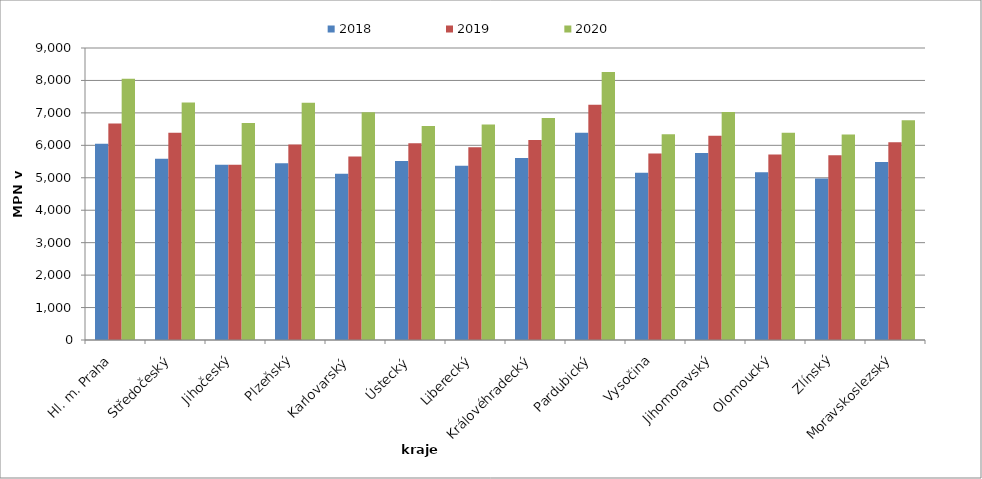
| Category | 2018 | 2019 | 2020 |
|---|---|---|---|
| Hl. m. Praha | 6052 | 6672 | 8049 |
| Středočeský | 5583 | 6389 | 7318 |
| Jihočeský | 5405 | 5405 | 6689 |
| Plzeňský | 5447 | 6028 | 7309 |
| Karlovarský  | 5126 | 5654 | 7020 |
| Ústecký   | 5515 | 6067 | 6593 |
| Liberecký | 5369 | 5940 | 6640 |
| Královéhradecký | 5606 | 6167 | 6845 |
| Pardubický | 6385 | 7250 | 8264 |
| Vysočina | 5157 | 5750 | 6344 |
| Jihomoravský | 5767 | 6299 | 7024 |
| Olomoucký | 5172 | 5715 | 6390 |
| Zlínský | 4974 | 5692 | 6331 |
| Moravskoslezský | 5487 | 6092 | 6770 |